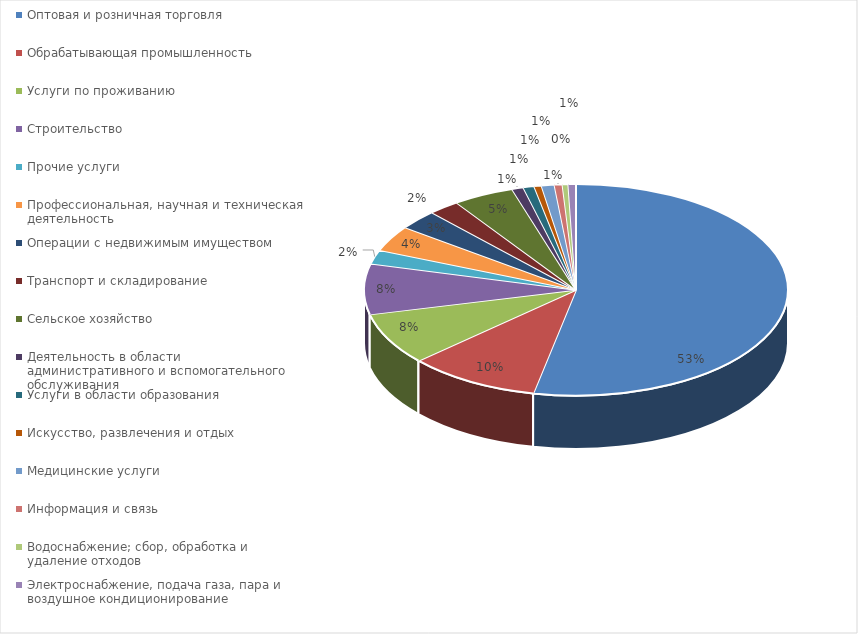
| Category | Series 0 |
|---|---|
| Оптовая и розничная торговля | 0.532 |
| Обрабатывающая промышленность | 0.101 |
| Услуги по проживанию | 0.08 |
| Строительство | 0.077 |
| Прочие услуги | 0.021 |
| Профессиональная, научная и техническая деятельность | 0.039 |
| Операции с недвижимым имуществом | 0.03 |
| Транспорт и складирование | 0.024 |
| Сельское хозяйство | 0.047 |
| Деятельность в области административного и вспомогательного обслуживания | 0.009 |
| Услуги в области образования | 0.008 |
| Искусство, развлечения и отдых | 0.006 |
| Медицинские услуги | 0.01 |
| Информация и связь | 0.006 |
| Водоснабжение; сбор, обработка и удаление отходов | 0.004 |
| Электроснабжение, подача газа, пара и воздушное кондиционирование | 0.006 |